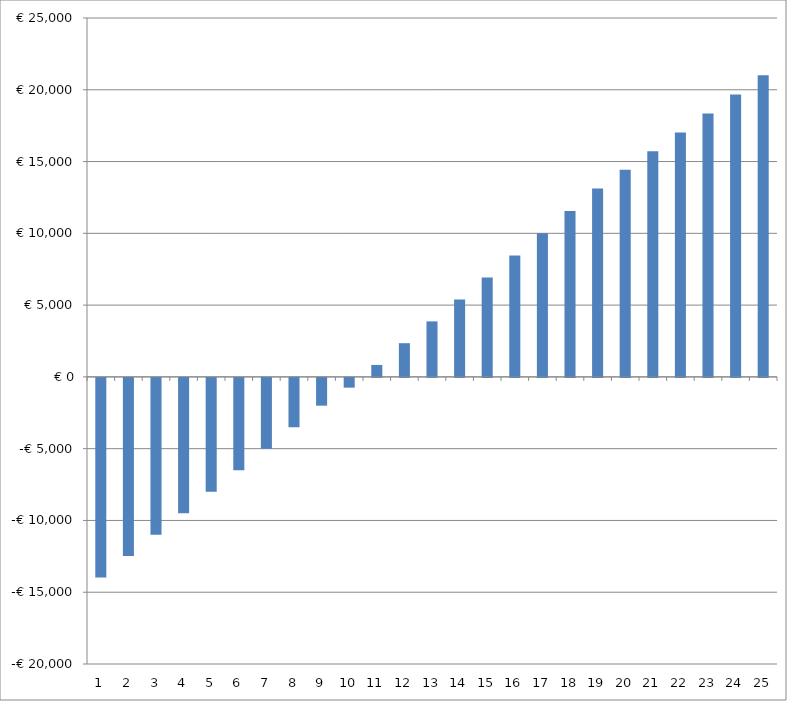
| Category | Series 0 |
|---|---|
| 0 | -13909.22 |
| 1 | -12415.779 |
| 2 | -10922.256 |
| 3 | -9428.224 |
| 4 | -7933.244 |
| 5 | -6436.871 |
| 6 | -4938.646 |
| 7 | -3438.102 |
| 8 | -1934.761 |
| 9 | -678.134 |
| 10 | 832.28 |
| 11 | 2346.992 |
| 12 | 3866.527 |
| 13 | 5391.421 |
| 14 | 6922.225 |
| 15 | 8459.502 |
| 16 | 10003.828 |
| 17 | 11555.795 |
| 18 | 13116.008 |
| 19 | 14435.089 |
| 20 | 15725.093 |
| 21 | 17026.405 |
| 22 | 18341.131 |
| 23 | 19669.936 |
| 24 | 21013.501 |